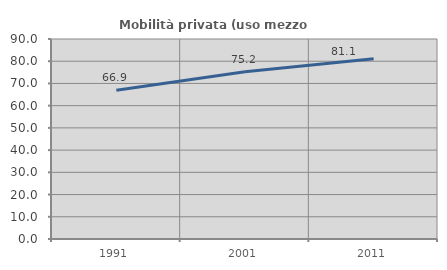
| Category | Mobilità privata (uso mezzo privato) |
|---|---|
| 1991.0 | 66.938 |
| 2001.0 | 75.223 |
| 2011.0 | 81.079 |